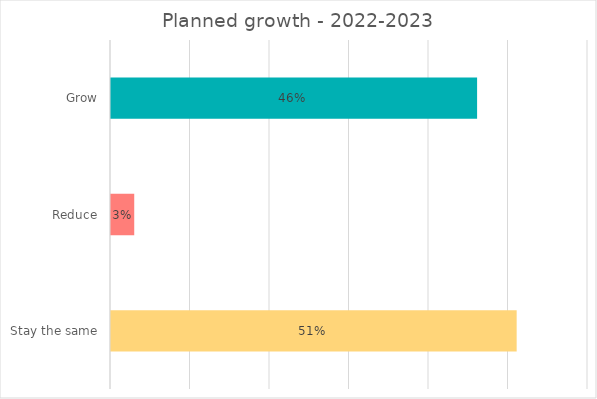
| Category | Series 0 |
|---|---|
| Grow | 46.05 |
| Reduce | 2.922 |
| Stay the same | 51.027 |